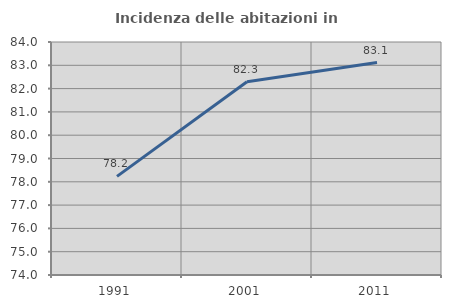
| Category | Incidenza delle abitazioni in proprietà  |
|---|---|
| 1991.0 | 78.232 |
| 2001.0 | 82.294 |
| 2011.0 | 83.116 |